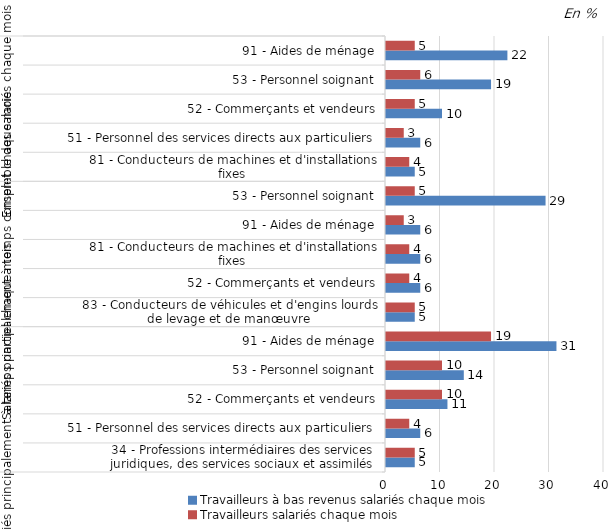
| Category | Travailleurs à bas revenus salariés chaque mois | Travailleurs salariés chaque mois |
|---|---|---|
| 0 | 5 | 5 |
| 1 | 6 | 4 |
| 2 | 11 | 10 |
| 3 | 14 | 10 |
| 4 | 31 | 19 |
| 5 | 5 | 5 |
| 6 | 6 | 4 |
| 7 | 6 | 4 |
| 8 | 6 | 3 |
| 9 | 29 | 5 |
| 10 | 5 | 4 |
| 11 | 6 | 3 |
| 12 | 10 | 5 |
| 13 | 19 | 6 |
| 14 | 22 | 5 |